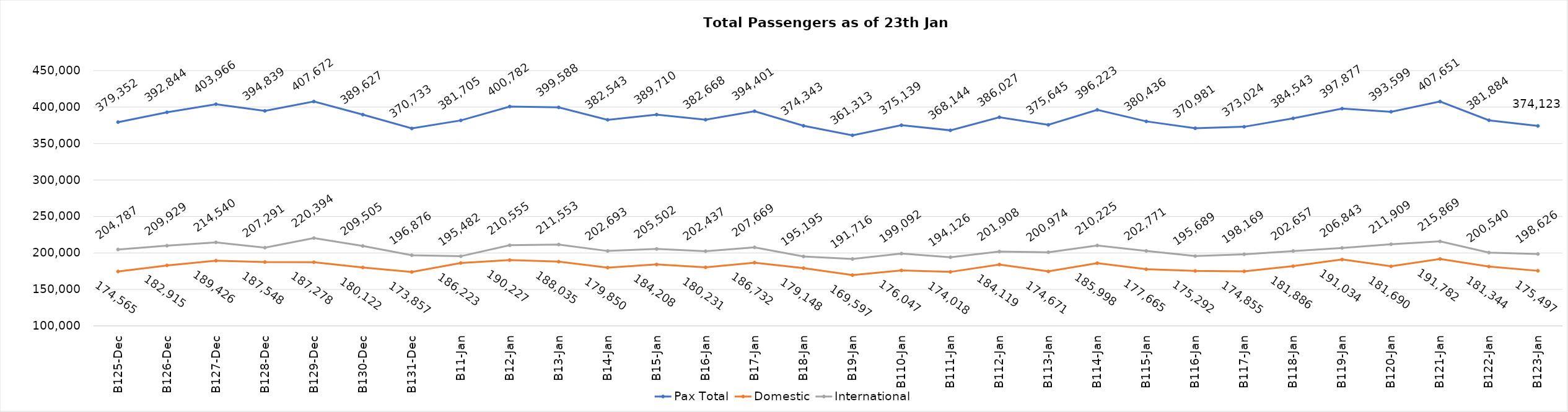
| Category | Pax Total | Domestic | International |
|---|---|---|---|
| 2023-12-25 | 379352 | 174565 | 204787 |
| 2023-12-26 | 392844 | 182915 | 209929 |
| 2023-12-27 | 403966 | 189426 | 214540 |
| 2023-12-28 | 394839 | 187548 | 207291 |
| 2023-12-29 | 407672 | 187278 | 220394 |
| 2023-12-30 | 389627 | 180122 | 209505 |
| 2023-12-31 | 370733 | 173857 | 196876 |
| 2024-01-01 | 381705 | 186223 | 195482 |
| 2024-01-02 | 400782 | 190227 | 210555 |
| 2024-01-03 | 399588 | 188035 | 211553 |
| 2024-01-04 | 382543 | 179850 | 202693 |
| 2024-01-05 | 389710 | 184208 | 205502 |
| 2024-01-06 | 382668 | 180231 | 202437 |
| 2024-01-07 | 394401 | 186732 | 207669 |
| 2024-01-08 | 374343 | 179148 | 195195 |
| 2024-01-09 | 361313 | 169597 | 191716 |
| 2024-01-10 | 375139 | 176047 | 199092 |
| 2024-01-11 | 368144 | 174018 | 194126 |
| 2024-01-12 | 386027 | 184119 | 201908 |
| 2024-01-13 | 375645 | 174671 | 200974 |
| 2024-01-14 | 396223 | 185998 | 210225 |
| 2024-01-15 | 380436 | 177665 | 202771 |
| 2024-01-16 | 370981 | 175292 | 195689 |
| 2024-01-17 | 373024 | 174855 | 198169 |
| 2024-01-18 | 384543 | 181886 | 202657 |
| 2024-01-19 | 397877 | 191034 | 206843 |
| 2024-01-20 | 393599 | 181690 | 211909 |
| 2024-01-21 | 407651 | 191782 | 215869 |
| 2024-01-22 | 381884 | 181344 | 200540 |
| 2024-01-23 | 374123 | 175497 | 198626 |